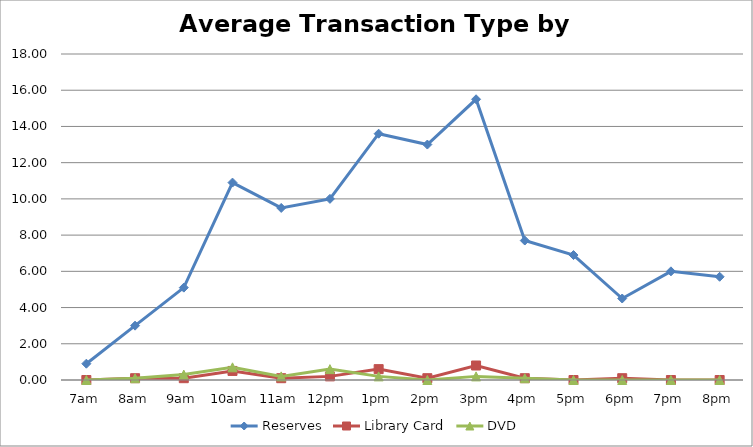
| Category | Reserves | Library Card | DVD |
|---|---|---|---|
| 7am | 0.9 | 0 | 0 |
| 8am | 3 | 0.1 | 0.1 |
| 9am | 5.1 | 0.1 | 0.3 |
| 10am | 10.9 | 0.5 | 0.7 |
| 11am | 9.5 | 0.1 | 0.2 |
| 12pm | 10 | 0.2 | 0.6 |
| 1pm | 13.6 | 0.6 | 0.2 |
| 2pm | 13 | 0.1 | 0 |
| 3pm | 15.5 | 0.8 | 0.2 |
| 4pm | 7.7 | 0.1 | 0.1 |
| 5pm | 6.9 | 0 | 0 |
| 6pm | 4.5 | 0.1 | 0 |
| 7pm | 6 | 0 | 0 |
| 8pm | 5.7 | 0 | 0 |